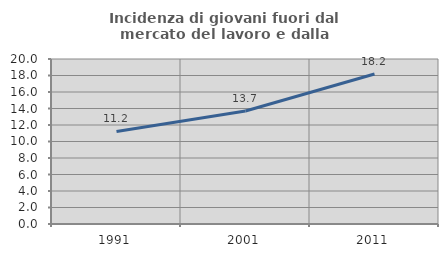
| Category | Incidenza di giovani fuori dal mercato del lavoro e dalla formazione  |
|---|---|
| 1991.0 | 11.224 |
| 2001.0 | 13.699 |
| 2011.0 | 18.182 |